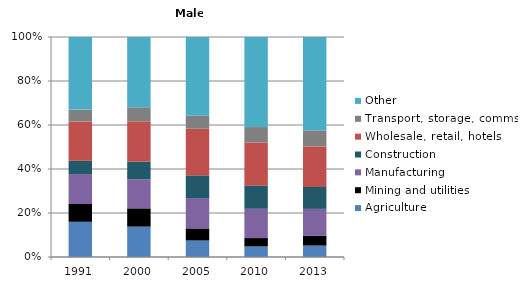
| Category | Agriculture | Mining and utilities | Manufacturing | Construction | Wholesale, retail, hotels | Transport, storage, comms | Other |
|---|---|---|---|---|---|---|---|
| 1991.0 | 16 | 8.1 | 13.6 | 6.1 | 17.8 | 5.4 | 33 |
| 2000.0 | 13.8 | 8.3 | 13.2 | 8 | 18.3 | 6.4 | 31.9 |
| 2005.0 | 7.5 | 5.5 | 13.8 | 10.3 | 21.2 | 5.9 | 35.8 |
| 2010.0 | 4.8 | 3.8 | 13.3 | 10.6 | 19.5 | 7 | 40.9 |
| 2013.0 | 5.2 | 4.4 | 12.3 | 10 | 18.4 | 7.3 | 42.5 |